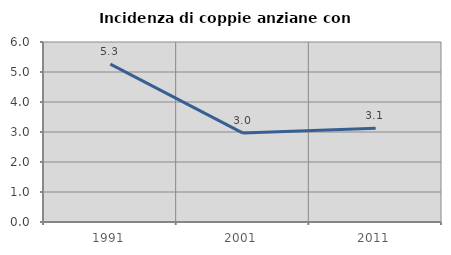
| Category | Incidenza di coppie anziane con figli |
|---|---|
| 1991.0 | 5.263 |
| 2001.0 | 2.963 |
| 2011.0 | 3.125 |